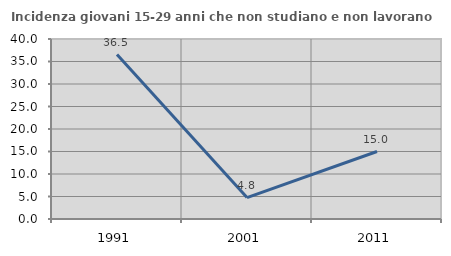
| Category | Incidenza giovani 15-29 anni che non studiano e non lavorano  |
|---|---|
| 1991.0 | 36.538 |
| 2001.0 | 4.762 |
| 2011.0 | 15 |